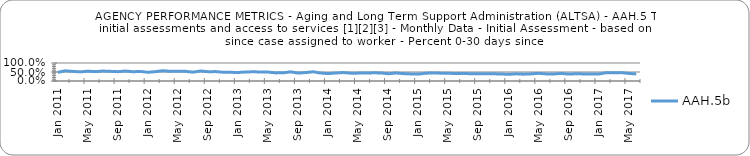
| Category | AAH.5b |
|---|---|
| 2011-01-01 | 0.481 |
| 2011-02-01 | 0.566 |
| 2011-03-01 | 0.535 |
| 2011-04-01 | 0.507 |
| 2011-05-01 | 0.546 |
| 2011-06-01 | 0.521 |
| 2011-07-01 | 0.552 |
| 2011-08-01 | 0.537 |
| 2011-09-01 | 0.518 |
| 2011-10-01 | 0.553 |
| 2011-11-01 | 0.516 |
| 2011-12-01 | 0.53 |
| 2012-01-01 | 0.485 |
| 2012-02-01 | 0.52 |
| 2012-03-01 | 0.57 |
| 2012-04-01 | 0.536 |
| 2012-05-01 | 0.547 |
| 2012-06-01 | 0.538 |
| 2012-07-01 | 0.491 |
| 2012-08-01 | 0.556 |
| 2012-09-01 | 0.516 |
| 2012-10-01 | 0.522 |
| 2012-11-01 | 0.488 |
| 2012-12-01 | 0.483 |
| 2013-01-01 | 0.473 |
| 2013-02-01 | 0.501 |
| 2013-03-01 | 0.511 |
| 2013-04-01 | 0.502 |
| 2013-05-01 | 0.496 |
| 2013-06-01 | 0.451 |
| 2013-07-01 | 0.453 |
| 2013-08-01 | 0.51 |
| 2013-09-01 | 0.438 |
| 2013-10-01 | 0.469 |
| 2013-11-01 | 0.513 |
| 2013-12-01 | 0.442 |
| 2014-01-01 | 0.41 |
| 2014-02-01 | 0.443 |
| 2014-03-01 | 0.468 |
| 2014-04-01 | 0.435 |
| 2014-05-01 | 0.438 |
| 2014-06-01 | 0.439 |
| 2014-07-01 | 0.454 |
| 2014-08-01 | 0.449 |
| 2014-09-01 | 0.404 |
| 2014-10-01 | 0.443 |
| 2014-11-01 | 0.411 |
| 2014-12-01 | 0.393 |
| 2015-01-01 | 0.383 |
| 2015-02-01 | 0.434 |
| 2015-03-01 | 0.449 |
| 2015-04-01 | 0.434 |
| 2015-05-01 | 0.428 |
| 2015-06-01 | 0.416 |
| 2015-07-01 | 0.424 |
| 2015-08-01 | 0.399 |
| 2015-09-01 | 0.397 |
| 2015-10-01 | 0.41 |
| 2015-11-01 | 0.399 |
| 2015-12-01 | 0.39 |
| 2016-01-01 | 0.371 |
| 2016-02-01 | 0.399 |
| 2016-03-01 | 0.38 |
| 2016-04-01 | 0.396 |
| 2016-05-01 | 0.428 |
| 2016-06-01 | 0.393 |
| 2016-07-01 | 0.39 |
| 2016-08-01 | 0.42 |
| 2016-09-01 | 0.385 |
| 2016-10-01 | 0.402 |
| 2016-11-01 | 0.393 |
| 2016-12-01 | 0.384 |
| 2017-01-01 | 0.387 |
| 2017-02-01 | 0.459 |
| 2017-03-01 | 0.453 |
| 2017-04-01 | 0.467 |
| 2017-05-01 | 0.42 |
| 2017-06-01 | 0.392 |